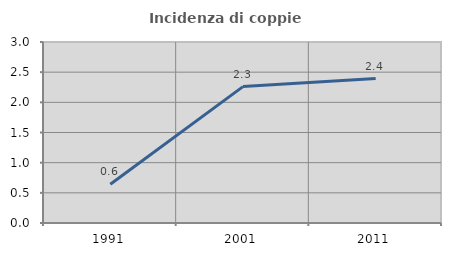
| Category | Incidenza di coppie miste |
|---|---|
| 1991.0 | 0.643 |
| 2001.0 | 2.261 |
| 2011.0 | 2.394 |